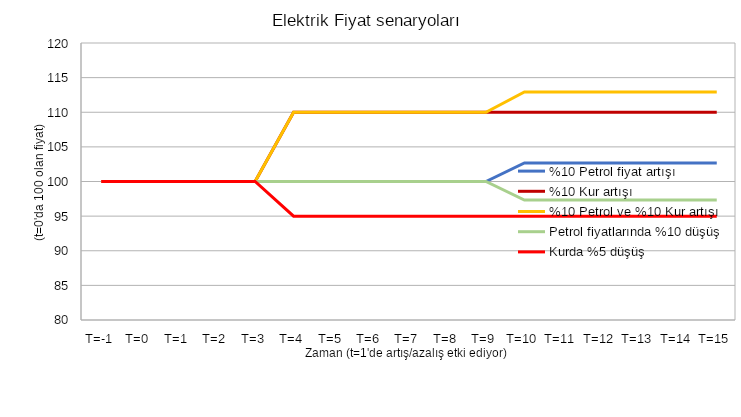
| Category | %10 Petrol fiyat artışı | %10 Kur artışı | %10 Petrol ve %10 Kur artışı | Petrol fiyatlarında %10 düşüş | Kurda %5 düşüş |
|---|---|---|---|---|---|
| T=-1 | 100 | 100 | 100 | 100 | 100 |
| T=0 | 100 | 100 | 100 | 100 | 100 |
| T=1 | 100 | 100 | 100 | 100 | 100 |
| T=2 | 100 | 100 | 100 | 100 | 100 |
| T=3 | 100 | 100 | 100 | 100 | 100 |
| T=4 | 100 | 110 | 110 | 100 | 95 |
| T=5 | 100 | 110 | 110 | 100 | 95 |
| T=6 | 100 | 110 | 110 | 100 | 95 |
| T=7 | 100 | 110 | 110 | 100 | 95 |
| T=8 | 100 | 110 | 110 | 100 | 95 |
| T=9 | 100 | 110 | 110 | 100 | 95 |
| T=10 | 102.673 | 110 | 112.94 | 97.327 | 95 |
| T=11 | 102.673 | 110 | 112.94 | 97.327 | 95 |
| T=12 | 102.673 | 110 | 112.94 | 97.327 | 95 |
| T=13 | 102.673 | 110 | 112.94 | 97.327 | 95 |
| T=14 | 102.673 | 110 | 112.94 | 97.327 | 95 |
| T=15 | 102.673 | 110 | 112.94 | 97.327 | 95 |